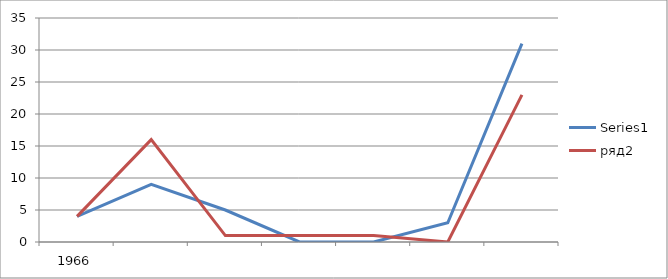
| Category | Series 0 | ряд2 |
|---|---|---|
| 0 | 4 | 4 |
| 1 | 9 | 16 |
| 2 | 5 | 1 |
| 3 | 0 | 1 |
| 4 | 0 | 1 |
| 5 | 3 | 0 |
| 6 | 31 | 23 |